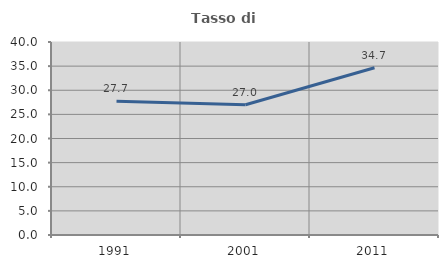
| Category | Tasso di occupazione   |
|---|---|
| 1991.0 | 27.727 |
| 2001.0 | 26.983 |
| 2011.0 | 34.652 |